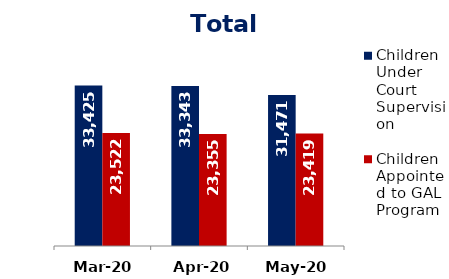
| Category | Children Under Court Supervision  | Children Appointed to GAL Program  |
|---|---|---|
| Mar-20 | 33425 | 23522 |
| Apr-20 | 33343 | 23355 |
| May-20 | 31471 | 23419 |